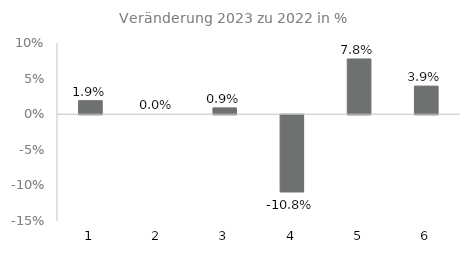
| Category | Series 1 |
|---|---|
| 0 | 0.019 |
| 1 | 0 |
| 2 | 0.009 |
| 3 | -0.108 |
| 4 | 0.078 |
| 5 | 0.039 |